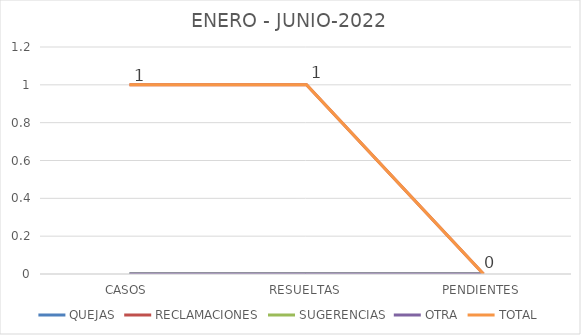
| Category | QUEJAS | RECLAMACIONES | SUGERENCIAS | OTRA | TOTAL |
|---|---|---|---|---|---|
| CASOS | 0 | 1 | 0 | 0 | 1 |
| RESUELTAS | 0 | 1 | 0 | 0 | 1 |
| PENDIENTES | 0 | 0 | 0 | 0 | 0 |